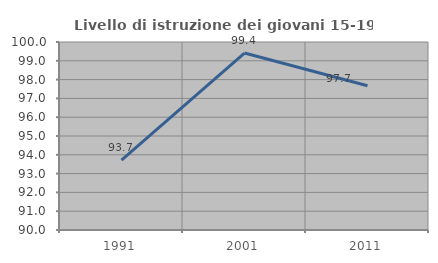
| Category | Livello di istruzione dei giovani 15-19 anni |
|---|---|
| 1991.0 | 93.722 |
| 2001.0 | 99.412 |
| 2011.0 | 97.674 |